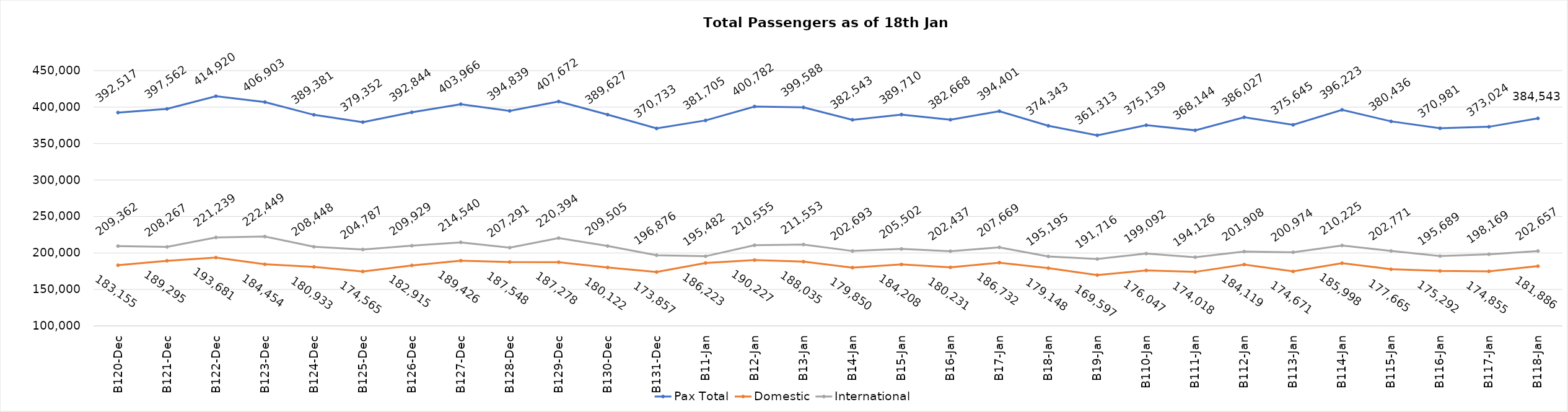
| Category | Pax Total | Domestic | International |
|---|---|---|---|
| 2023-12-20 | 392517 | 183155 | 209362 |
| 2023-12-21 | 397562 | 189295 | 208267 |
| 2023-12-22 | 414920 | 193681 | 221239 |
| 2023-12-23 | 406903 | 184454 | 222449 |
| 2023-12-24 | 389381 | 180933 | 208448 |
| 2023-12-25 | 379352 | 174565 | 204787 |
| 2023-12-26 | 392844 | 182915 | 209929 |
| 2023-12-27 | 403966 | 189426 | 214540 |
| 2023-12-28 | 394839 | 187548 | 207291 |
| 2023-12-29 | 407672 | 187278 | 220394 |
| 2023-12-30 | 389627 | 180122 | 209505 |
| 2023-12-31 | 370733 | 173857 | 196876 |
| 2024-01-01 | 381705 | 186223 | 195482 |
| 2024-01-02 | 400782 | 190227 | 210555 |
| 2024-01-03 | 399588 | 188035 | 211553 |
| 2024-01-04 | 382543 | 179850 | 202693 |
| 2024-01-05 | 389710 | 184208 | 205502 |
| 2024-01-06 | 382668 | 180231 | 202437 |
| 2024-01-07 | 394401 | 186732 | 207669 |
| 2024-01-08 | 374343 | 179148 | 195195 |
| 2024-01-09 | 361313 | 169597 | 191716 |
| 2024-01-10 | 375139 | 176047 | 199092 |
| 2024-01-11 | 368144 | 174018 | 194126 |
| 2024-01-12 | 386027 | 184119 | 201908 |
| 2024-01-13 | 375645 | 174671 | 200974 |
| 2024-01-14 | 396223 | 185998 | 210225 |
| 2024-01-15 | 380436 | 177665 | 202771 |
| 2024-01-16 | 370981 | 175292 | 195689 |
| 2024-01-17 | 373024 | 174855 | 198169 |
| 2024-01-18 | 384543 | 181886 | 202657 |